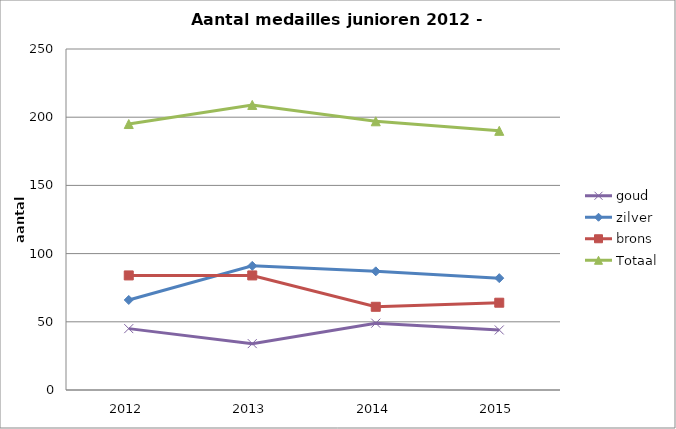
| Category | goud | zilver | brons | Totaal |
|---|---|---|---|---|
| 2012.0 | 45 | 66 | 84 | 195 |
| 2013.0 | 34 | 91 | 84 | 209 |
| 2014.0 | 49 | 87 | 61 | 197 |
| 2015.0 | 44 | 82 | 64 | 190 |